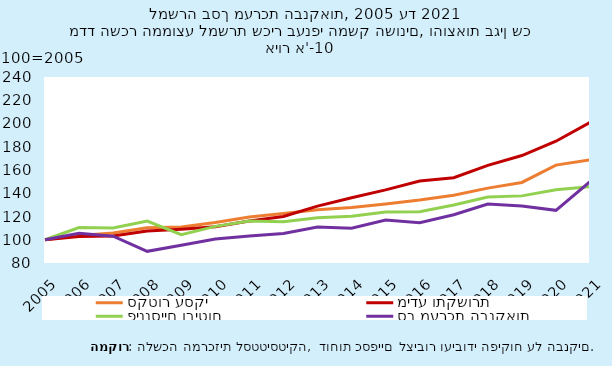
| Category | סקטור עסקי | מידע ותקשורת | פיננסיים וביטוח | סך מערכת הבנקאות |
|---|---|---|---|---|
| 2005-12-31 | 100 | 100 | 100 | 100 |
| 2006-12-31 | 103.745 | 102.782 | 110.566 | 105.516 |
| 2007-12-31 | 105.787 | 103.279 | 110.029 | 103.039 |
| 2008-12-31 | 110.351 | 107.496 | 116.058 | 90.043 |
| 2009-12-31 | 111.07 | 109.127 | 104.374 | 95.326 |
| 2010-12-31 | 114.918 | 111.261 | 111.493 | 100.668 |
| 2011-12-31 | 119.474 | 116.16 | 116.066 | 103.243 |
| 2012-12-31 | 122.645 | 120.017 | 115.583 | 105.465 |
| 2013-12-31 | 125.751 | 128.904 | 118.98 | 110.966 |
| 2014-12-31 | 127.832 | 136.068 | 120.194 | 109.911 |
| 2015-12-31 | 130.716 | 142.911 | 123.943 | 116.897 |
| 2016-12-31 | 134.149 | 150.514 | 124.075 | 114.568 |
| 2017-12-31 | 138.352 | 153.336 | 129.93 | 121.554 |
| 2018-12-31 | 144.429 | 163.967 | 136.717 | 130.707 |
| 2019-12-31 | 149.295 | 172.463 | 137.739 | 129.006 |
| 2020-12-31 | 164.193 | 184.744 | 143.038 | 125.28 |
| 2021-12-31 | 168.797 | 200.938 | 145.633 | 149.963 |